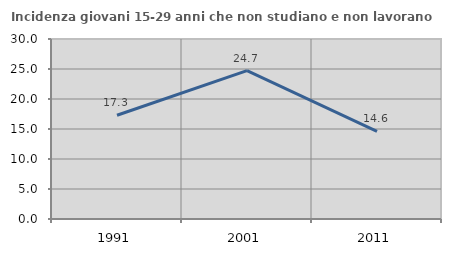
| Category | Incidenza giovani 15-29 anni che non studiano e non lavorano  |
|---|---|
| 1991.0 | 17.299 |
| 2001.0 | 24.719 |
| 2011.0 | 14.607 |